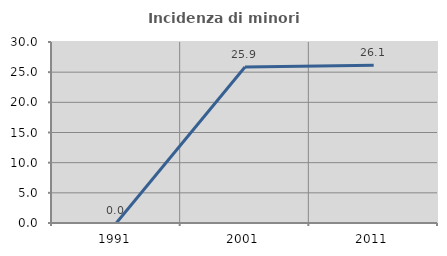
| Category | Incidenza di minori stranieri |
|---|---|
| 1991.0 | 0 |
| 2001.0 | 25.862 |
| 2011.0 | 26.144 |